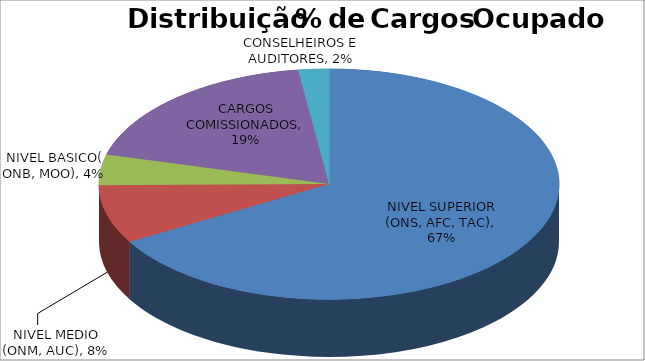
| Category | Series 0 |
|---|---|
| NIVEL SUPERIOR (ONS, AFC, TAC) | 0.667 |
| NIVEL MEDIO (ONM, AUC) | 0.082 |
| NIVEL BASICO( ONB, MOO) | 0.043 |
| CARGOS COMISSIONADOS | 0.187 |
| CONSELHEIROS E AUDITORES | 0.022 |